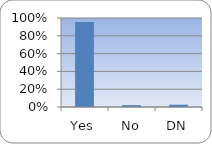
| Category | Series 0 |
|---|---|
| Yes | 0.954 |
| No | 0.021 |
| DN | 0.026 |